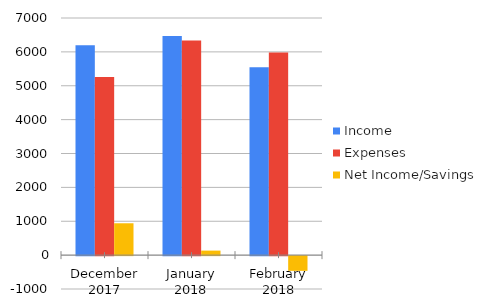
| Category | Income | Expenses | Net Income/Savings |
|---|---|---|---|
| December 2017 | 6197.588 | 5257.102 | 940.486 |
| January 2018 | 6467 | 6333.443 | 133.557 |
| February 2018 | 5544 | 5978.703 | -434.703 |